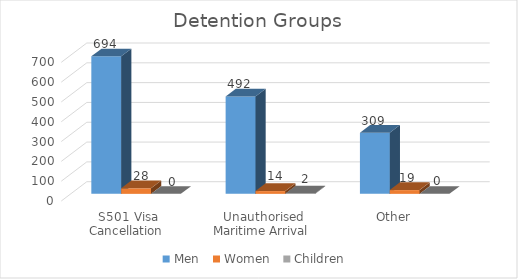
| Category | Men  | Women  | Children  |
|---|---|---|---|
| S501 Visa Cancellation  | 694 | 28 | 0 |
| Unauthorised Maritime Arrival  | 492 | 14 | 2 |
| Other  | 309 | 19 | 0 |